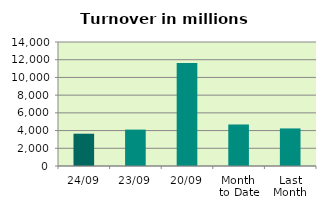
| Category | Series 0 |
|---|---|
| 24/09 | 3645.104 |
| 23/09 | 4108.675 |
| 20/09 | 11630.261 |
| Month 
to Date | 4687.144 |
| Last
Month | 4240.294 |